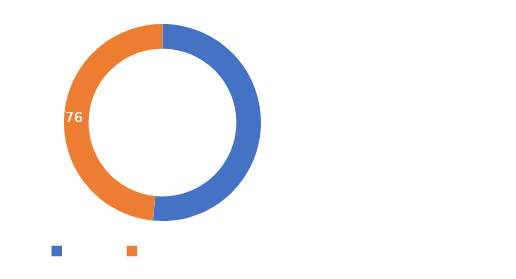
| Category | Series 0 |
|---|---|
| META  | 100 |
| CUMPLIMIENTO | 94 |